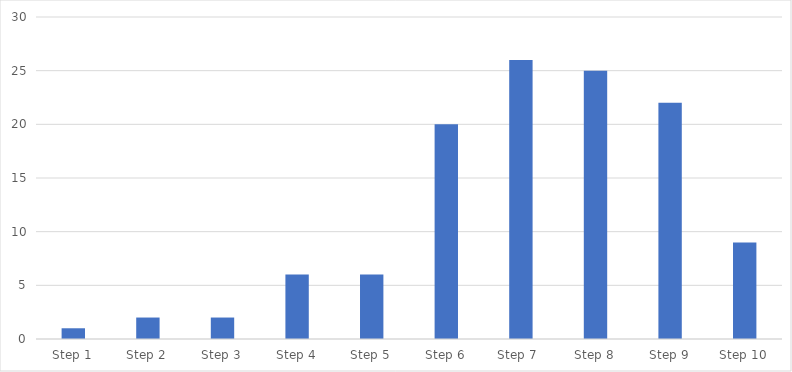
| Category | Number of Responses |
|---|---|
| Step 1 | 1 |
| Step 2 | 2 |
| Step 3 | 2 |
| Step 4 | 6 |
| Step 5 | 6 |
| Step 6 | 20 |
| Step 7  | 26 |
| Step 8 | 25 |
| Step 9 | 22 |
| Step 10 | 9 |